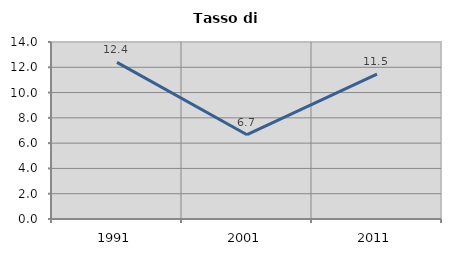
| Category | Tasso di disoccupazione   |
|---|---|
| 1991.0 | 12.384 |
| 2001.0 | 6.667 |
| 2011.0 | 11.453 |